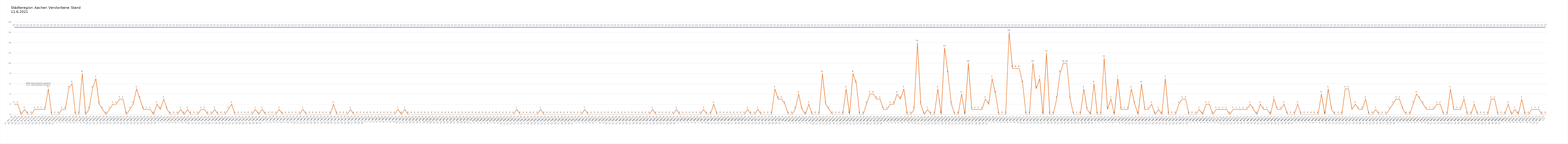
| Category | Verstorbene gesamt | Verstorbene Corona |
|---|---|---|
| 0 | 17 | 2 |
| 1 | 17 | 2 |
| 2 | 17 | 0 |
| 3 | 17 | 1 |
| 4 | 17 | 0 |
| 5 | 17 | 0 |
| 6 | 17 | 1 |
| 7 | 17 | 1 |
| 8 | 17 | 1 |
| 9 | 17 | 1 |
| 10 | 17 | 5 |
| 11 | 17 | 0 |
| 12 | 17 | 0 |
| 13 | 17 | 0 |
| 14 | 17 | 1 |
| 15 | 17 | 1 |
| 16 | 17 | 5 |
| 17 | 17 | 6 |
| 18 | 17 | 0 |
| 19 | 17 | 0 |
| 20 | 17 | 8 |
| 21 | 17 | 0 |
| 22 | 17 | 1 |
| 23 | 17 | 5 |
| 24 | 17 | 7 |
| 25 | 17 | 2 |
| 26 | 17 | 1 |
| 27 | 17 | 0 |
| 28 | 17 | 1 |
| 29 | 17 | 2 |
| 30 | 17 | 2 |
| 31 | 17 | 3 |
| 32 | 17 | 3 |
| 33 | 17 | 0 |
| 34 | 17 | 1 |
| 35 | 17 | 2 |
| 36 | 17 | 5 |
| 37 | 17 | 3 |
| 38 | 17 | 1 |
| 39 | 17 | 1 |
| 40 | 17 | 1 |
| 41 | 17 | 0 |
| 42 | 17 | 2 |
| 43 | 17 | 1 |
| 44 | 17 | 3 |
| 45 | 17 | 1 |
| 46 | 17 | 0 |
| 47 | 17 | 0 |
| 48 | 17 | 0 |
| 49 | 17 | 1 |
| 50 | 17 | 0 |
| 51 | 17 | 1 |
| 52 | 17 | 0 |
| 53 | 17 | 0 |
| 54 | 17 | 0 |
| 55 | 17 | 1 |
| 56 | 17 | 1 |
| 57 | 17 | 0 |
| 58 | 17 | 0 |
| 59 | 17 | 1 |
| 60 | 17 | 0 |
| 61 | 17 | 0 |
| 62 | 17 | 0 |
| 63 | 17 | 1 |
| 64 | 17 | 2 |
| 65 | 17 | 0 |
| 66 | 17 | 0 |
| 67 | 17 | 0 |
| 68 | 17 | 0 |
| 69 | 17 | 0 |
| 70 | 17 | 0 |
| 71 | 17 | 1 |
| 72 | 17 | 0 |
| 73 | 17 | 1 |
| 74 | 17 | 0 |
| 75 | 17 | 0 |
| 76 | 17 | 0 |
| 77 | 17 | 0 |
| 78 | 17 | 1 |
| 79 | 17 | 0 |
| 80 | 17 | 0 |
| 81 | 17 | 0 |
| 82 | 17 | 0 |
| 83 | 17 | 0 |
| 84 | 17 | 0 |
| 85 | 17 | 1 |
| 86 | 17 | 0 |
| 87 | 17 | 0 |
| 88 | 17 | 0 |
| 89 | 17 | 0 |
| 90 | 17 | 0 |
| 91 | 17 | 0 |
| 92 | 17 | 0 |
| 93 | 17 | 0 |
| 94 | 17 | 2 |
| 95 | 17 | 0 |
| 96 | 17 | 0 |
| 97 | 17 | 0 |
| 98 | 17 | 0 |
| 99 | 17 | 1 |
| 100 | 17 | 0 |
| 101 | 17 | 0 |
| 102 | 17 | 0 |
| 103 | 17 | 0 |
| 104 | 17 | 0 |
| 105 | 17 | 0 |
| 106 | 17 | 0 |
| 107 | 17 | 0 |
| 108 | 17 | 0 |
| 109 | 17 | 0 |
| 110 | 17 | 0 |
| 111 | 17 | 0 |
| 112 | 17 | 0 |
| 113 | 17 | 1 |
| 114 | 17 | 0 |
| 115 | 17 | 1 |
| 116 | 17 | 0 |
| 117 | 17 | 0 |
| 118 | 17 | 0 |
| 119 | 17 | 0 |
| 120 | 17 | 0 |
| 121 | 17 | 0 |
| 122 | 17 | 0 |
| 123 | 17 | 0 |
| 124 | 17 | 0 |
| 125 | 17 | 0 |
| 126 | 17 | 0 |
| 127 | 17 | 0 |
| 128 | 17 | 0 |
| 129 | 17 | 0 |
| 130 | 17 | 0 |
| 131 | 17 | 0 |
| 132 | 17 | 0 |
| 133 | 17 | 0 |
| 134 | 17 | 0 |
| 135 | 17 | 0 |
| 136 | 17 | 0 |
| 137 | 17 | 0 |
| 138 | 17 | 0 |
| 139 | 17 | 0 |
| 140 | 17 | 0 |
| 141 | 17 | 0 |
| 142 | 17 | 0 |
| 143 | 17 | 0 |
| 144 | 17 | 0 |
| 145 | 17 | 0 |
| 146 | 17 | 0 |
| 147 | 17 | 0 |
| 148 | 17 | 1 |
| 149 | 17 | 0 |
| 150 | 17 | 0 |
| 151 | 17 | 0 |
| 152 | 17 | 0 |
| 153 | 17 | 0 |
| 154 | 17 | 0 |
| 155 | 17 | 1 |
| 156 | 17 | 0 |
| 157 | 17 | 0 |
| 158 | 17 | 0 |
| 159 | 17 | 0 |
| 160 | 17 | 0 |
| 161 | 17 | 0 |
| 162 | 17 | 0 |
| 163 | 17 | 0 |
| 164 | 17 | 0 |
| 165 | 17 | 0 |
| 166 | 17 | 0 |
| 167 | 17 | 0 |
| 168 | 17 | 1 |
| 169 | 17 | 0 |
| 170 | 17 | 0 |
| 171 | 17 | 0 |
| 172 | 17 | 0 |
| 173 | 17 | 0 |
| 174 | 17 | 0 |
| 175 | 17 | 0 |
| 176 | 17 | 0 |
| 177 | 17 | 0 |
| 178 | 17 | 0 |
| 179 | 17 | 0 |
| 180 | 17 | 0 |
| 181 | 17 | 0 |
| 182 | 17 | 0 |
| 183 | 17 | 0 |
| 184 | 17 | 0 |
| 185 | 17 | 0 |
| 186 | 17 | 0 |
| 187 | 17 | 0 |
| 188 | 17 | 1 |
| 189 | 17 | 0 |
| 190 | 17 | 0 |
| 191 | 17 | 0 |
| 192 | 17 | 0 |
| 193 | 17 | 0 |
| 194 | 17 | 0 |
| 195 | 17 | 1 |
| 196 | 17 | 0 |
| 197 | 17 | 0 |
| 198 | 17 | 0 |
| 199 | 17 | 0 |
| 200 | 17 | 0 |
| 201 | 17 | 0 |
| 202 | 17 | 0 |
| 203 | 17 | 1 |
| 204 | 17 | 0 |
| 205 | 17 | 0 |
| 206 | 17 | 2 |
| 207 | 17 | 0 |
| 208 | 17 | 0 |
| 209 | 17 | 0 |
| 210 | 17 | 0 |
| 211 | 17 | 0 |
| 212 | 17 | 0 |
| 213 | 17 | 0 |
| 214 | 17 | 0 |
| 215 | 17 | 0 |
| 216 | 17 | 1 |
| 217 | 17 | 0 |
| 218 | 17 | 0 |
| 219 | 17 | 1 |
| 220 | 17 | 0 |
| 221 | 17 | 0 |
| 222 | 17 | 0 |
| 223 | 17 | 0 |
| 224 | 17 | 5 |
| 225 | 17 | 3 |
| 226 | 17 | 3 |
| 227 | 17 | 2 |
| 228 | 17 | 0 |
| 229 | 17 | 0 |
| 230 | 17 | 1 |
| 231 | 17 | 4 |
| 232 | 17 | 1 |
| 233 | 17 | 0 |
| 234 | 17 | 2 |
| 235 | 17 | 0 |
| 236 | 17 | 0 |
| 237 | 17 | 0 |
| 238 | 17 | 8 |
| 239 | 17 | 2 |
| 240 | 17 | 1 |
| 241 | 17 | 0 |
| 242 | 17 | 0 |
| 243 | 17 | 0 |
| 244 | 17 | 0 |
| 245 | 17 | 5 |
| 246 | 17 | 0 |
| 247 | 17 | 8 |
| 248 | 17 | 6 |
| 249 | 17 | 0 |
| 250 | 17 | 0 |
| 251 | 17 | 2 |
| 252 | 17 | 4 |
| 253 | 17 | 4 |
| 254 | 17 | 3 |
| 255 | 17 | 3 |
| 256 | 17 | 1 |
| 257 | 17 | 1 |
| 258 | 17 | 2 |
| 259 | 17 | 2 |
| 260 | 17 | 4 |
| 261 | 17 | 3 |
| 262 | 17 | 5 |
| 263 | 17 | 0 |
| 264 | 17 | 0 |
| 265 | 17 | 1 |
| 266 | 17 | 14 |
| 267 | 17 | 2 |
| 268 | 17 | 0 |
| 269 | 17 | 1 |
| 270 | 17 | 0 |
| 271 | 17 | 0 |
| 272 | 17 | 5 |
| 273 | 17 | 0 |
| 274 | 17 | 13 |
| 275 | 17 | 8 |
| 276 | 17 | 2 |
| 277 | 17 | 0 |
| 278 | 17 | 0 |
| 279 | 17 | 4 |
| 280 | 17 | 0 |
| 281 | 17 | 10 |
| 282 | 17 | 1 |
| 283 | 17 | 1 |
| 284 | 17 | 1 |
| 285 | 17 | 1 |
| 286 | 17 | 3 |
| 287 | 17 | 2 |
| 288 | 17 | 7 |
| 289 | 17 | 4 |
| 290 | 17 | 0 |
| 291 | 17 | 0 |
| 292 | 17 | 0 |
| 293 | 17 | 16 |
| 294 | 17 | 9 |
| 295 | 17 | 9 |
| 296 | 17 | 9 |
| 297 | 17 | 6 |
| 298 | 17 | 0 |
| 299 | 17 | 0 |
| 300 | 17 | 10 |
| 301 | 17 | 5 |
| 302 | 17 | 7 |
| 303 | 17 | 0 |
| 304 | 17 | 12 |
| 305 | 17 | 0 |
| 306 | 17 | 0 |
| 307 | 17 | 3 |
| 308 | 17 | 8 |
| 309 | 17 | 10 |
| 310 | 17 | 10 |
| 311 | 17 | 3 |
| 312 | 17 | 0 |
| 313 | 17 | 0 |
| 314 | 17 | 0 |
| 315 | 17 | 5 |
| 316 | 17 | 1 |
| 317 | 17 | 0 |
| 318 | 17 | 6 |
| 319 | 17 | 0 |
| 320 | 17 | 0 |
| 321 | 17 | 11 |
| 322 | 17 | 1 |
| 323 | 17 | 3 |
| 324 | 17 | 0 |
| 325 | 17 | 7 |
| 326 | 17 | 1 |
| 327 | 17 | 1 |
| 328 | 17 | 1 |
| 329 | 17 | 5 |
| 330 | 17 | 2 |
| 331 | 17 | 0 |
| 332 | 17 | 6 |
| 333 | 17 | 1 |
| 334 | 17 | 1 |
| 335 | 17 | 2 |
| 336 | 17 | 0 |
| 337 | 17 | 1 |
| 338 | 17 | 0 |
| 339 | 17 | 7 |
| 340 | 17 | 0 |
| 341 | 17 | 0 |
| 342 | 17 | 0 |
| 343 | 17 | 2 |
| 344 | 17 | 3 |
| 345 | 17 | 3 |
| 346 | 17 | 0 |
| 347 | 17 | 0 |
| 348 | 17 | 0 |
| 349 | 17 | 1 |
| 350 | 17 | 0 |
| 351 | 17 | 2 |
| 352 | 17 | 2 |
| 353 | 17 | 0 |
| 354 | 17 | 1 |
| 355 | 17 | 1 |
| 356 | 17 | 1 |
| 357 | 17 | 1 |
| 358 | 17 | 0 |
| 359 | 17 | 1 |
| 360 | 17 | 1 |
| 361 | 17 | 1 |
| 362 | 17 | 1 |
| 363 | 17 | 1 |
| 364 | 17 | 2 |
| 365 | 17 | 1 |
| 366 | 17 | 0 |
| 367 | 17 | 2 |
| 368 | 17 | 1 |
| 369 | 17 | 1 |
| 370 | 17 | 0 |
| 371 | 17 | 3 |
| 372 | 17 | 1 |
| 373 | 17 | 1 |
| 374 | 17 | 2 |
| 375 | 17 | 0 |
| 376 | 17 | 0 |
| 377 | 17 | 0 |
| 378 | 17 | 2 |
| 379 | 17 | 0 |
| 380 | 17 | 0 |
| 381 | 17 | 0 |
| 382 | 17 | 0 |
| 383 | 17 | 0 |
| 384 | 17 | 0 |
| 385 | 17 | 4 |
| 386 | 17 | 0 |
| 387 | 17 | 5 |
| 388 | 17 | 1 |
| 389 | 17 | 0 |
| 390 | 17 | 0 |
| 391 | 17 | 0 |
| 392 | 17 | 5 |
| 393 | 17 | 5 |
| 394 | 17 | 1 |
| 395 | 17 | 2 |
| 396 | 17 | 1 |
| 397 | 17 | 1 |
| 398 | 17 | 3 |
| 399 | 17 | 0 |
| 400 | 17 | 0 |
| 401 | 17 | 1 |
| 402 | 17 | 0 |
| 403 | 17 | 0 |
| 404 | 17 | 0 |
| 405 | 17 | 1 |
| 406 | 17 | 2 |
| 407 | 17 | 3 |
| 408 | 17 | 3 |
| 409 | 17 | 1 |
| 410 | 17 | 0 |
| 411 | 17 | 0 |
| 412 | 17 | 2 |
| 413 | 17 | 4 |
| 414 | 17 | 3 |
| 415 | 17 | 2 |
| 416 | 17 | 1 |
| 417 | 17 | 1 |
| 418 | 17 | 1 |
| 419 | 17 | 2 |
| 420 | 17 | 2 |
| 421 | 17 | 0 |
| 422 | 17 | 0 |
| 423 | 17 | 5 |
| 424 | 17 | 1 |
| 425 | 17 | 1 |
| 426 | 17 | 1 |
| 427 | 17 | 3 |
| 428 | 17 | 0 |
| 429 | 17 | 0 |
| 430 | 17 | 2 |
| 431 | 17 | 0 |
| 432 | 17 | 0 |
| 433 | 17 | 0 |
| 434 | 17 | 0 |
| 435 | 17 | 3 |
| 436 | 17 | 3 |
| 437 | 17 | 0 |
| 438 | 17 | 0 |
| 439 | 17 | 0 |
| 440 | 17 | 2 |
| 441 | 17 | 0 |
| 442 | 17 | 1 |
| 443 | 17 | 0 |
| 444 | 17 | 3 |
| 445 | 17 | 0 |
| 446 | 17 | 0 |
| 447 | 17 | 1 |
| 448 | 17 | 1 |
| 449 | 17 | 1 |
| 450 | 17 | 0 |
| 451 | 17 | 0 |